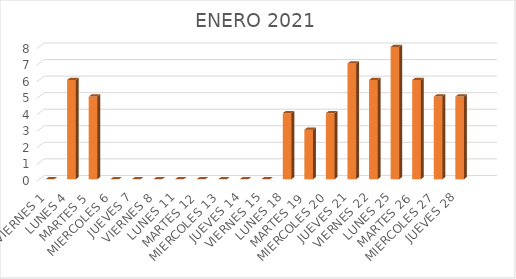
| Category | DIAS | PERSONAS ATENDIDAS | Series 1 |
|---|---|---|---|
| VIERNES 1 |  |  | 0 |
| LUNES 4 |  |  | 6 |
| MARTES 5 |  |  | 5 |
| MIERCOLES 6 |  |  | 0 |
| JUEVES 7 |  |  | 0 |
| VIERNES 8 |  |  | 0 |
| LUNES 11 |  |  | 0 |
| MARTES 12 |  |  | 0 |
| MIERCOLES 13 |  |  | 0 |
| JUEVES 14 |  |  | 0 |
| VIERNES 15 |  |  | 0 |
| LUNES 18 |  |  | 4 |
| MARTES 19 |  |  | 3 |
| MIERCOLES 20 |  |  | 4 |
| JUEVES 21 |  |  | 7 |
| VIERNES 22 |  |  | 6 |
| LUNES 25 |  |  | 8 |
| MARTES 26 |  |  | 6 |
| MIERCOLES 27 |  |  | 5 |
| JUEVES 28 |  |  | 5 |